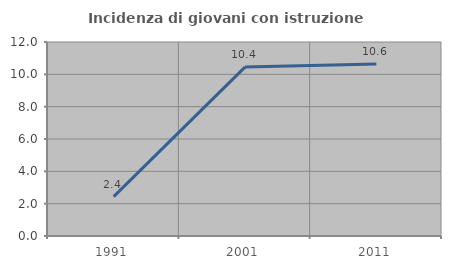
| Category | Incidenza di giovani con istruzione universitaria |
|---|---|
| 1991.0 | 2.439 |
| 2001.0 | 10.448 |
| 2011.0 | 10.638 |